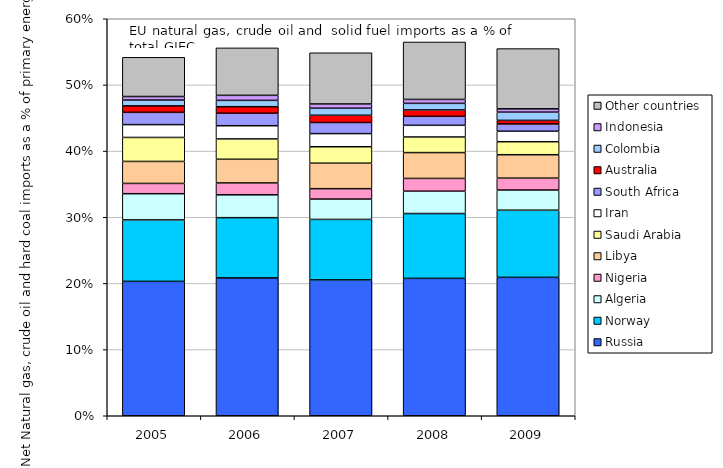
| Category | Russia | Norway | Algeria | Nigeria | Libya | Saudi Arabia | Iran | South Africa | Australia | Colombia | Indonesia | Other countries |
|---|---|---|---|---|---|---|---|---|---|---|---|---|
| 2005.0 | 0.203 | 0.093 | 0.04 | 0.016 | 0.033 | 0.036 | 0.019 | 0.019 | 0.01 | 0.009 | 0.005 | 0.059 |
| 2006.0 | 0.208 | 0.091 | 0.035 | 0.018 | 0.036 | 0.031 | 0.02 | 0.019 | 0.01 | 0.01 | 0.008 | 0.072 |
| 2007.0 | 0.205 | 0.091 | 0.031 | 0.016 | 0.038 | 0.025 | 0.02 | 0.017 | 0.011 | 0.011 | 0.006 | 0.077 |
| 2008.0 | 0.208 | 0.098 | 0.034 | 0.019 | 0.039 | 0.024 | 0.018 | 0.014 | 0.01 | 0.01 | 0.006 | 0.087 |
| 2009.0 | 0.209 | 0.102 | 0.03 | 0.018 | 0.035 | 0.02 | 0.016 | 0.011 | 0.005 | 0.012 | 0.005 | 0.091 |